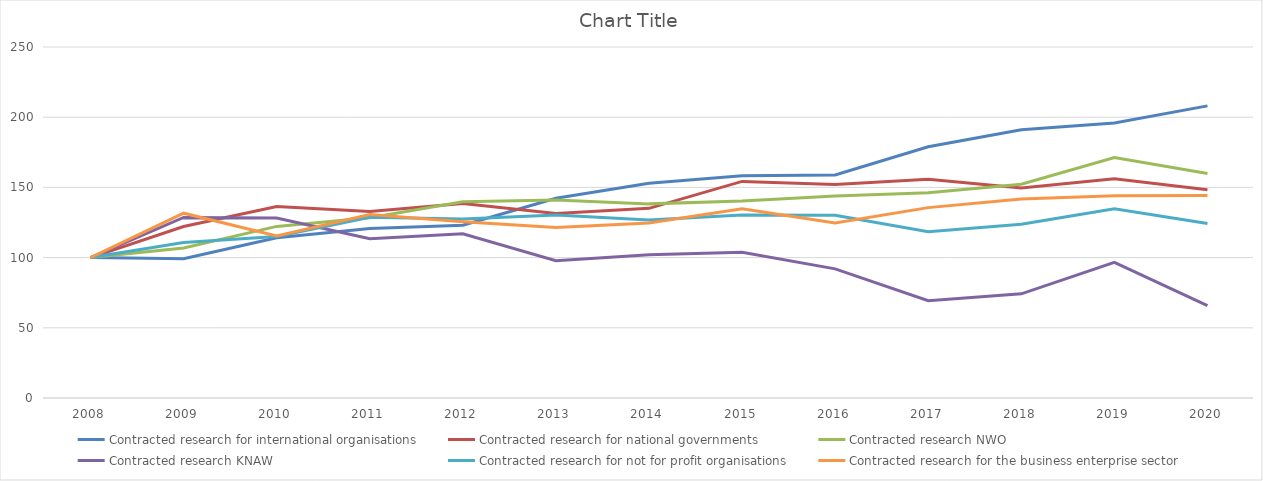
| Category | Contracted research for international organisations | Contracted research for national governments | Contracted research NWO | Contracted research KNAW | Contracted research for not for profit organisations | Contracted research for the business enterprise sector |
|---|---|---|---|---|---|---|
| 2008.0 | 100 | 100 | 100 | 100 | 100 | 100 |
| 2009.0 | 99.189 | 122.144 | 106.817 | 128.598 | 110.731 | 131.63 |
| 2010.0 | 114.149 | 136.372 | 122.232 | 128.13 | 115.008 | 115.482 |
| 2011.0 | 120.732 | 132.753 | 128.402 | 113.399 | 128.759 | 130.673 |
| 2012.0 | 123.039 | 138.484 | 139.707 | 116.942 | 127.459 | 125.593 |
| 2013.0 | 142.22 | 131.403 | 141.031 | 97.83 | 130.305 | 121.413 |
| 2014.0 | 152.96 | 135.095 | 138.266 | 102.038 | 126.706 | 124.712 |
| 2015.0 | 158.279 | 154.264 | 140.232 | 103.727 | 130.325 | 134.846 |
| 2016.0 | 158.86 | 152.108 | 143.909 | 91.981 | 130.207 | 124.638 |
| 2017.0 | 178.967 | 155.848 | 146.24 | 69.322 | 118.493 | 135.598 |
| 2018.0 | 191.019 | 149.662 | 152.304 | 74.183 | 123.704 | 141.741 |
| 2019.0 | 195.808 | 156.188 | 171.207 | 96.584 | 134.785 | 144.121 |
| 2020.0 | 208.076 | 148.256 | 159.854 | 65.851 | 124.24 | 144.286 |